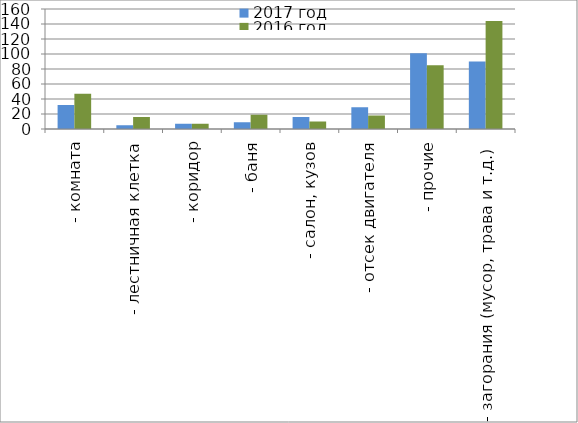
| Category | 2017 год | 2016 год |
|---|---|---|
|  - комната | 32 | 47 |
|  - лестничная клетка | 5 | 16 |
|  - коридор | 7 | 7 |
|  - баня | 9 | 19 |
|  - салон, кузов | 16 | 10 |
|  - отсек двигателя | 29 | 18 |
| - прочие | 101 | 85 |
| - загорания (мусор, трава и т.д.)  | 90 | 144 |